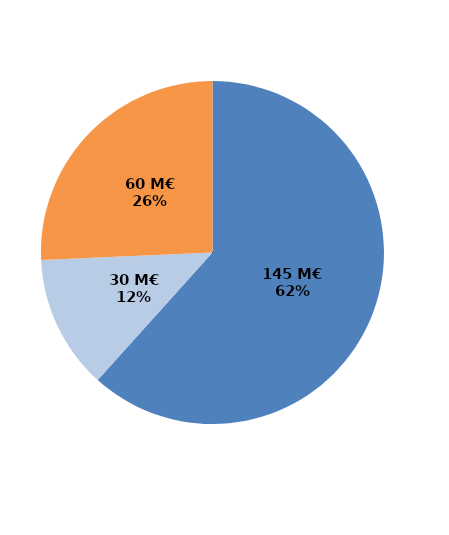
| Category | Series 0 |
|---|---|
| Formations certifiantes et pré-certifiantes | 144.551 |
| Formations professionnalisantes | 29.633 |
| Formations d'insertion sociale et professionnelle | 60.212 |